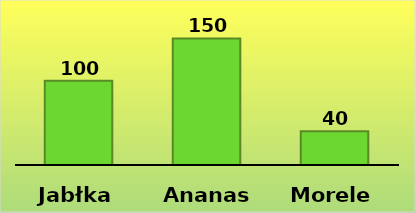
| Category | Series 0 |
|---|---|
| Jabłka | 100 |
| Ananasy | 150 |
| Morele | 40 |